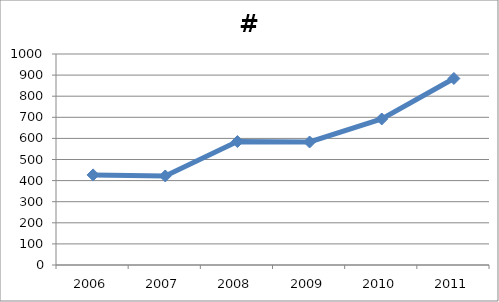
| Category | # Students |
|---|---|
| 2006.0 | 427 |
| 2007.0 | 422 |
| 2008.0 | 585 |
| 2009.0 | 583 |
| 2010.0 | 692 |
| 2011.0 | 884 |